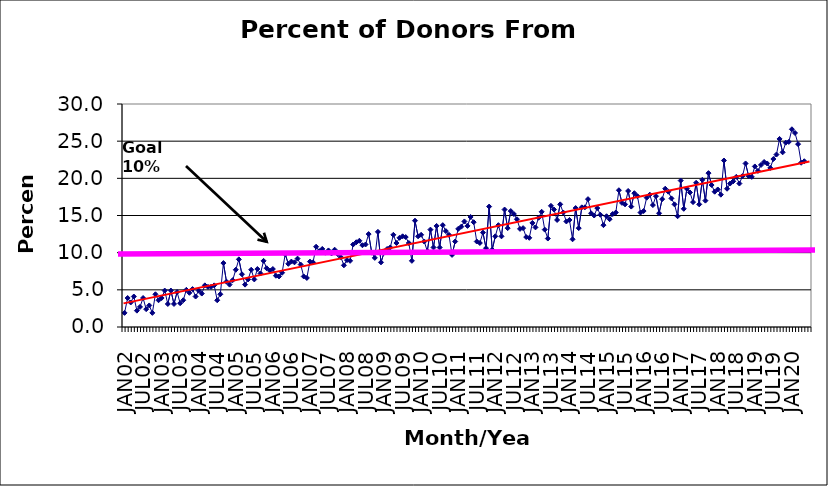
| Category | Series 0 |
|---|---|
| JAN02 | 1.9 |
| FEB02 | 3.9 |
| MAR02 | 3.3 |
| APR02 | 4.1 |
| MAY02 | 2.2 |
| JUN02 | 2.7 |
| JUL02 | 3.9 |
| AUG02 | 2.4 |
| SEP02 | 2.9 |
| OCT02 | 1.9 |
| NOV02 | 4.4 |
| DEC02 | 3.6 |
| JAN03 | 3.9 |
| FEB03 | 4.9 |
| MAR03 | 3.1 |
| APR03 | 4.9 |
| MAY03 | 3.1 |
| JUN03 | 4.7 |
| JUL03 | 3.2 |
| AUG03 | 3.6 |
| SEP03 | 5 |
| OCT03 | 4.6 |
| NOV03 | 5.1 |
| DEC03 | 4.1 |
| JAN04 | 4.9 |
| FEB04 | 4.5 |
| MAR04 | 5.6 |
| APR04 | 5.4 |
| MAY04 | 5.4 |
| JUN04 | 5.6 |
| JUL04 | 3.6 |
| AUG04 | 4.4 |
| SEP04 | 8.6 |
| OCT04 | 6.1 |
| NOV04 | 5.7 |
| DEC04 | 6.3 |
| JAN05 | 7.7 |
| FEB05 | 9.1 |
| MAR05 | 7.1 |
| APR05 | 5.7 |
| MAY05 | 6.4 |
| JUN05 | 7.7 |
| JUL05 | 6.4 |
| AUG05 | 7.8 |
| SEP05 | 7.2 |
| OCT05 | 8.9 |
| NOV05 | 7.9 |
| DEC05 | 7.6 |
| JAN06 | 7.8 |
| FEB06 | 6.9 |
| MAR06 | 6.8 |
| APR06 | 7.3 |
| MAY06 | 9.8 |
| JUN06 | 8.5 |
| JUL06 | 8.8 |
| AUG06 | 8.7 |
| SEP06 | 9.2 |
| OCT06 | 8.4 |
| NOV06 | 6.8 |
| DEC06 | 6.6 |
| JAN07 | 8.8 |
| FEB07 | 8.7 |
| MAR07 | 10.8 |
| APR07 | 10.2 |
| MAY07 | 10.5 |
| JUN07 | 10 |
| JUL07 | 10.3 |
| AUG07 | 9.9 |
| SEP07 | 10.4 |
| OCT07 | 9.8 |
| NOV07 | 9.4 |
| DEC07 | 8.3 |
| JAN08 | 9 |
| FEB08 | 8.9 |
| MAR08 | 11.1 |
| APR08 | 11.4 |
| MAY08 | 11.6 |
| JUN08 | 11 |
| JUL08 | 11.1 |
| AUG08 | 12.5 |
| SEP08 | 10 |
| OCT08 | 9.3 |
| NOV08 | 12.8 |
| DEC08 | 8.7 |
| JAN09 | 10 |
| FEB09 | 10.5 |
| MAR09 | 10.7 |
| APR09 | 12.4 |
| MAY09 | 11.3 |
| JUN09 | 12 |
| JUL09 | 12.2 |
| AUG09 | 12.1 |
| SEP09 | 11.3 |
| OCT09 | 8.9 |
| NOV09 | 14.3 |
| DEC09 | 12.2 |
| JAN10 | 12.4 |
| FEB10 | 11.5 |
| MAR10 | 10.2 |
| APR10 | 13.1 |
| MAY10 | 10.7 |
| JUN10 | 13.6 |
| JUL10 | 10.7 |
| AUG10 | 13.7 |
| SEP10 | 12.9 |
| OCT10 | 12.4 |
| NOV10 | 9.7 |
| DEC10 | 11.5 |
| JAN11 | 13.2 |
| FEB11 | 13.5 |
| MAR11 | 14.2 |
| APR11 | 13.6 |
| MAY11 | 14.8 |
| JUN11 | 14.1 |
| JUL11 | 11.5 |
| AUG11 | 11.3 |
| SEP11 | 12.7 |
| OCT11 | 10.6 |
| NOV11 | 16.2 |
| DEC11 | 10.4 |
| JAN12 | 12.2 |
| FEB12 | 13.7 |
| MAR12 | 12.2 |
| APR12 | 15.8 |
| MAY12 | 13.3 |
| JUN12 | 15.6 |
| JUL12 | 15.2 |
| AUG12 | 14.5 |
| SEP12 | 13.2 |
| OCT12 | 13.3 |
| NOV12 | 12.1 |
| DEC12 | 12 |
| JAN13 | 14 |
| FEB13 | 13.4 |
| MAR13 | 14.7 |
| APR13 | 15.5 |
| MAY13 | 13.1 |
| JUN13 | 11.9 |
| JUL13 | 16.3 |
| AUG13 | 15.8 |
| SEP13 | 14.4 |
| OCT13 | 16.5 |
| NOV13 | 15.4 |
| DEC13 | 14.2 |
| JAN14 | 14.4 |
| FEB14 | 11.8 |
| MAR14 | 16 |
| APR14 | 13.3 |
| MAY14 | 16.1 |
| JUN14 | 16.1 |
| JUL14 | 17.2 |
| AUG14 | 15.3 |
| SEP14 | 15 |
| OCT14 | 16 |
| NOV14 | 15.1 |
| DEC14 | 13.7 |
| JAN15 | 14.9 |
| FEB15 | 14.5 |
| MAR15 | 15.2 |
| APR15 | 15.4 |
| MAY15 | 18.4 |
| JUN15 | 16.7 |
| JUL15 | 16.5 |
| AUG15 | 18.3 |
| SEP15 | 16.2 |
| OCT15 | 18 |
| NOV15 | 17.6 |
| DEC15 | 15.4 |
| JAN16 | 15.6 |
| FEB16 | 17.4 |
| MAR16 | 17.8 |
| APR16 | 16.4 |
| MAY16 | 17.6 |
| JUN16 | 15.3 |
| JUL16 | 17.2 |
| AUG16 | 18.6 |
| SEP16 | 18.2 |
| OCT16 | 17.3 |
| NOV16 | 16.5 |
| DEC16 | 14.9 |
| JAN17 | 19.7 |
| FEB17 | 15.9 |
| MAR17 | 18.6 |
| APR17 | 18.1 |
| MAY17 | 16.8 |
| JUN17 | 19.4 |
| JUL17 | 16.5 |
| AUG17 | 19.8 |
| SEP17 | 17 |
| OCT17 | 20.7 |
| NOV17 | 19.1 |
| DEC17 | 18.2 |
| JAN18 | 18.5 |
| FEB18 | 17.8 |
| MAR18 | 22.4 |
| APR18 | 18.6 |
| MAY18 | 19.3 |
| JUN18 | 19.6 |
| JUL18 | 20.2 |
| AUG18 | 19.3 |
| SEP18 | 20.3 |
| OCT18 | 22 |
| NOV18 | 20.3 |
| DEC18 | 20.2 |
| JAN19 | 21.6 |
| FEB19 | 21 |
| MAR19 | 21.8 |
| APR19 | 22.2 |
| MAY19 | 22 |
| JUN19 | 21.4 |
| JUL19 | 22.6 |
| AUG19 | 23.2 |
| SEP19 | 25.3 |
| OCT19 | 23.5 |
| NOV19 | 24.8 |
| DEC19 | 24.9 |
| JAN20 | 26.6 |
| FEB20 | 26.1 |
| MAR20 | 24.6 |
| APR20 | 22.1 |
| MAY20 | 22.3 |